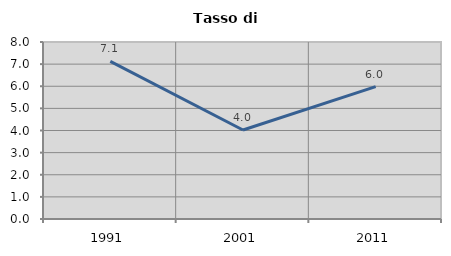
| Category | Tasso di disoccupazione   |
|---|---|
| 1991.0 | 7.124 |
| 2001.0 | 4.021 |
| 2011.0 | 5.984 |